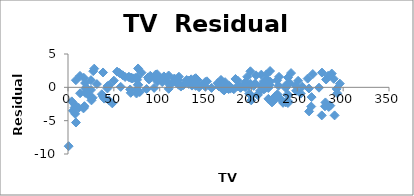
| Category | Series 0 |
|---|---|
| 230.1 | 1.576 |
| 44.5 | -1.938 |
| 17.2 | -3.008 |
| 151.5 | 0.902 |
| 180.8 | -0.289 |
| 8.7 | -5.278 |
| 57.5 | 0.07 |
| 120.2 | 1.077 |
| 8.6 | 1.073 |
| 199.8 | -1.951 |
| 66.1 | 1.568 |
| 214.7 | 0.115 |
| 23.8 | -1.377 |
| 97.5 | 0.874 |
| 204.1 | 0.566 |
| 195.4 | 1.581 |
| 67.8 | -0.324 |
| 281.4 | 1.175 |
| 69.2 | 1.348 |
| 147.3 | 0.434 |
| 218.4 | -0.101 |
| 237.4 | -2.241 |
| 13.2 | -0.889 |
| 228.3 | -1.046 |
| 62.3 | 1.553 |
| 262.9 | -3.61 |
| 142.9 | 0.01 |
| 240.1 | -1.152 |
| 248.8 | -0.511 |
| 70.6 | 1.356 |
| 292.9 | -0.234 |
| 112.9 | 0.554 |
| 97.2 | 1.961 |
| 265.6 | -1.464 |
| 95.7 | 1.925 |
| 290.7 | -4.207 |
| 266.9 | 1.994 |
| 74.7 | -0.923 |
| 43.1 | 0.191 |
| 228.0 | 1.052 |
| 202.5 | 0.222 |
| 177.0 | -0.196 |
| 293.6 | -0.896 |
| 206.9 | -1.064 |
| 25.1 | -0.388 |
| 175.1 | -0.262 |
| 89.7 | 1.727 |
| 239.9 | 1.477 |
| 227.2 | -1.464 |
| 66.9 | 1.532 |
| 199.8 | -1.231 |
| 100.4 | 1.36 |
| 216.4 | 1.937 |
| 182.6 | 1.255 |
| 262.7 | -0.174 |
| 198.9 | 2.407 |
| 7.3 | -3.028 |
| 136.2 | 0.425 |
| 210.8 | 1.902 |
| 210.7 | 0.267 |
| 53.5 | 2.358 |
| 261.3 | 1.309 |
| 239.3 | -1.084 |
| 102.7 | 0.789 |
| 131.1 | 1.022 |
| 69.0 | 1.451 |
| 31.5 | 0.484 |
| 139.3 | 1.363 |
| 237.4 | -0.077 |
| 216.8 | 1.191 |
| 199.1 | 0.521 |
| 109.8 | 1.773 |
| 26.8 | -1.567 |
| 129.4 | 1.097 |
| 213.4 | -0.329 |
| 16.9 | -3.158 |
| 27.5 | 2.422 |
| 120.5 | 0.388 |
| 5.4 | -3.513 |
| 116.0 | 1.325 |
| 76.4 | 0.354 |
| 239.8 | -2.348 |
| 75.3 | 1.122 |
| 68.4 | -0.822 |
| 213.5 | 0.919 |
| 193.2 | 0.019 |
| 76.3 | 0.401 |
| 110.7 | 0.406 |
| 88.3 | 1.189 |
| 109.8 | -0.222 |
| 134.3 | 1.201 |
| 28.6 | 2.804 |
| 217.7 | 0.244 |
| 250.9 | 0.972 |
| 107.4 | 1.018 |
| 163.3 | 0.585 |
| 197.6 | -0.936 |
| 184.9 | 0.163 |
| 289.7 | 1.281 |
| 135.2 | 0.26 |
| 222.4 | -2.176 |
| 296.4 | 0.558 |
| 280.2 | -2.844 |
| 187.9 | -0.062 |
| 238.2 | 0.399 |
| 137.9 | 1.264 |
| 25.0 | 1.074 |
| 90.4 | 1.591 |
| 13.1 | 1.713 |
| 255.4 | 0.107 |
| 225.8 | -1.36 |
| 241.7 | 0.66 |
| 175.7 | 0.219 |
| 209.6 | -0.504 |
| 78.2 | -0.705 |
| 75.1 | -0.32 |
| 139.2 | 0.221 |
| 76.4 | 2.829 |
| 125.7 | 0.334 |
| 19.4 | -0.22 |
| 141.3 | 1.09 |
| 18.8 | -0.838 |
| 224.0 | -2.026 |
| 123.1 | 0.117 |
| 229.5 | 0.246 |
| 87.2 | 1.473 |
| 7.8 | -3.977 |
| 80.2 | 2.2 |
| 220.3 | 2.445 |
| 59.6 | 1.816 |
| 0.7 | -8.828 |
| 265.2 | -2.878 |
| 8.4 | -2.749 |
| 219.8 | 0.333 |
| 36.9 | -1.037 |
| 48.3 | -2.401 |
| 25.6 | -1.953 |
| 273.7 | -0.051 |
| 43.0 | -0.168 |
| 184.9 | 1.025 |
| 73.4 | 1.41 |
| 193.7 | 0.801 |
| 220.5 | 0.85 |
| 104.6 | 1.635 |
| 96.2 | 1.309 |
| 140.3 | 0.591 |
| 240.1 | -2.094 |
| 243.2 | 2.139 |
| 38.0 | -1.363 |
| 44.7 | 0.273 |
| 280.7 | -2.267 |
| 121.0 | 1.59 |
| 197.6 | 0.24 |
| 171.3 | 0.776 |
| 187.8 | 0.098 |
| 4.1 | -2.108 |
| 93.9 | -0.085 |
| 149.8 | 0.086 |
| 11.7 | -3.084 |
| 131.7 | 0.501 |
| 172.5 | 0.186 |
| 85.7 | -0.259 |
| 188.4 | -0.047 |
| 163.5 | 0.648 |
| 117.2 | 0.832 |
| 234.5 | -2.324 |
| 17.9 | -2.824 |
| 206.8 | -1.163 |
| 215.4 | -0.086 |
| 284.3 | -2.942 |
| 50.0 | 1.005 |
| 164.5 | 0.142 |
| 19.6 | -0.008 |
| 168.4 | -0.271 |
| 222.4 | -2.244 |
| 276.9 | 2.213 |
| 248.4 | 0.221 |
| 170.2 | -0.462 |
| 276.7 | -4.211 |
| 165.6 | 0.215 |
| 156.6 | -0.087 |
| 218.5 | -1.728 |
| 56.2 | 2.145 |
| 287.6 | 2.067 |
| 253.8 | -0.939 |
| 205.0 | 1.797 |
| 139.5 | 0.609 |
| 191.1 | 0.224 |
| 286.0 | -2.744 |
| 18.7 | 0.648 |
| 39.5 | -1.689 |
| 75.5 | 1.476 |
| 17.2 | 1.434 |
| 166.8 | 1.113 |
| 149.7 | 0.805 |
| 38.2 | 2.23 |
| 94.2 | 1.535 |
| 177.0 | 0.014 |
| 283.6 | 1.733 |
| 232.1 | -1.773 |